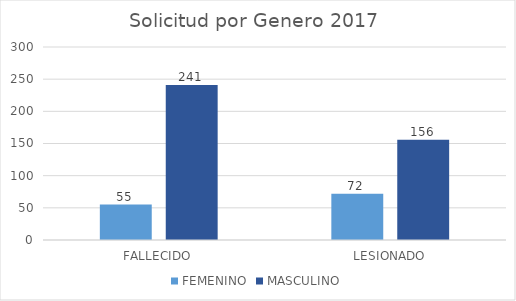
| Category | FEMENINO | MASCULINO |
|---|---|---|
| FALLECIDO | 55 | 241 |
| LESIONADO | 72 | 156 |